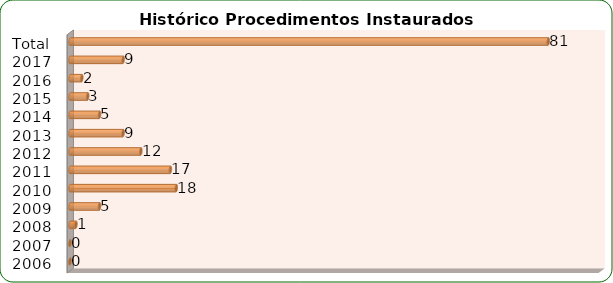
| Category | Total de Sindicâncias  |
|---|---|
| 2006 | 0 |
| 2007 | 0 |
| 2008 | 1 |
| 2009 | 5 |
| 2010 | 18 |
| 2011 | 17 |
| 2012 | 12 |
| 2013 | 9 |
| 2014 | 5 |
| 2015 | 3 |
| 2016 | 2 |
| 2017 | 9 |
| Total | 81 |